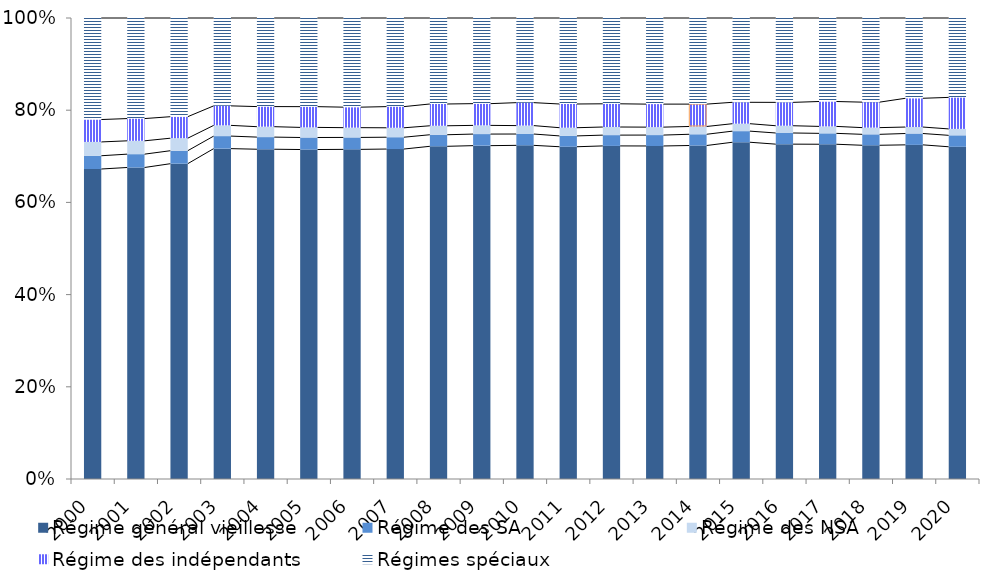
| Category | Régime général vieillesse | Régime des SA | Régime des NSA | Régime des indépendants | Régimes spéciaux |
|---|---|---|---|---|---|
| 2000.0 | 0.672 | 0.029 | 0.03 | 0.049 | 0.22 |
| 2001.0 | 0.676 | 0.029 | 0.029 | 0.048 | 0.218 |
| 2002.0 | 0.684 | 0.028 | 0.027 | 0.047 | 0.214 |
| 2003.0 | 0.717 | 0.027 | 0.023 | 0.042 | 0.191 |
| 2004.0 | 0.715 | 0.026 | 0.023 | 0.044 | 0.192 |
| 2005.0 | 0.715 | 0.026 | 0.022 | 0.045 | 0.192 |
| 2006.0 | 0.715 | 0.026 | 0.021 | 0.044 | 0.193 |
| 2007.0 | 0.716 | 0.026 | 0.02 | 0.046 | 0.192 |
| 2008.0 | 0.722 | 0.025 | 0.019 | 0.047 | 0.187 |
| 2009.0 | 0.723 | 0.025 | 0.019 | 0.047 | 0.186 |
| 2010.0 | 0.724 | 0.025 | 0.018 | 0.05 | 0.184 |
| 2011.0 | 0.721 | 0.023 | 0.018 | 0.051 | 0.187 |
| 2012.0 | 0.723 | 0.023 | 0.018 | 0.05 | 0.186 |
| 2013.0 | 0.722 | 0.024 | 0.017 | 0.05 | 0.187 |
| 2014.0 | 0.723 | 0.024 | 0.017 | 0.049 | 0.187 |
| 2015.0 | 0.73 | 0.024 | 0.016 | 0.046 | 0.183 |
| 2016.0 | 0.726 | 0.024 | 0.016 | 0.051 | 0.183 |
| 2017.0 | 0.726 | 0.024 | 0.015 | 0.054 | 0.181 |
| 2018.0 | 0.724 | 0.024 | 0.015 | 0.055 | 0.183 |
| 2019.0 | 0.725 | 0.025 | 0.014 | 0.062 | 0.174 |
| 2020.0 | 0.721 | 0.025 | 0.014 | 0.068 | 0.172 |